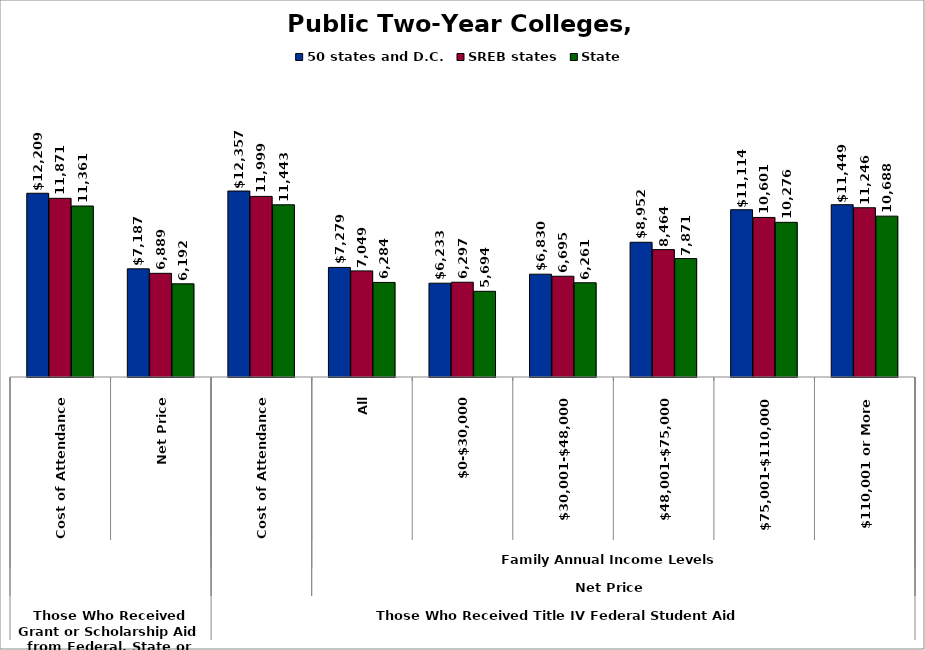
| Category | 50 states and D.C. | SREB states | State |
|---|---|---|---|
| 0 | 12208.901 | 11870.892 | 11361.427 |
| 1 | 7186.568 | 6888.804 | 6192.133 |
| 2 | 12356.818 | 11998.652 | 11443.071 |
| 3 | 7279.324 | 7049.483 | 6284.172 |
| 4 | 6232.702 | 6296.833 | 5694.116 |
| 5 | 6830.45 | 6694.826 | 6261.449 |
| 6 | 8951.622 | 8464.184 | 7871.304 |
| 7 | 11114.377 | 10601.455 | 10276.266 |
| 8 | 11448.649 | 11245.937 | 10688.269 |